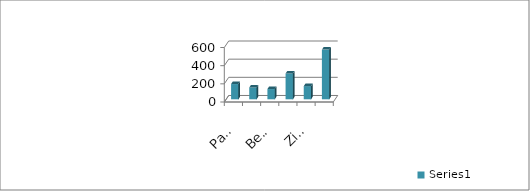
| Category | Series 0 |
|---|---|
| Papes bāka | 168 |
| Jūrmalciems | 130 |
| Bernāti | 113 |
| Liepāja Karosta | 284 |
| Ziemupe | 145 |
| Pāvilosta | 547 |